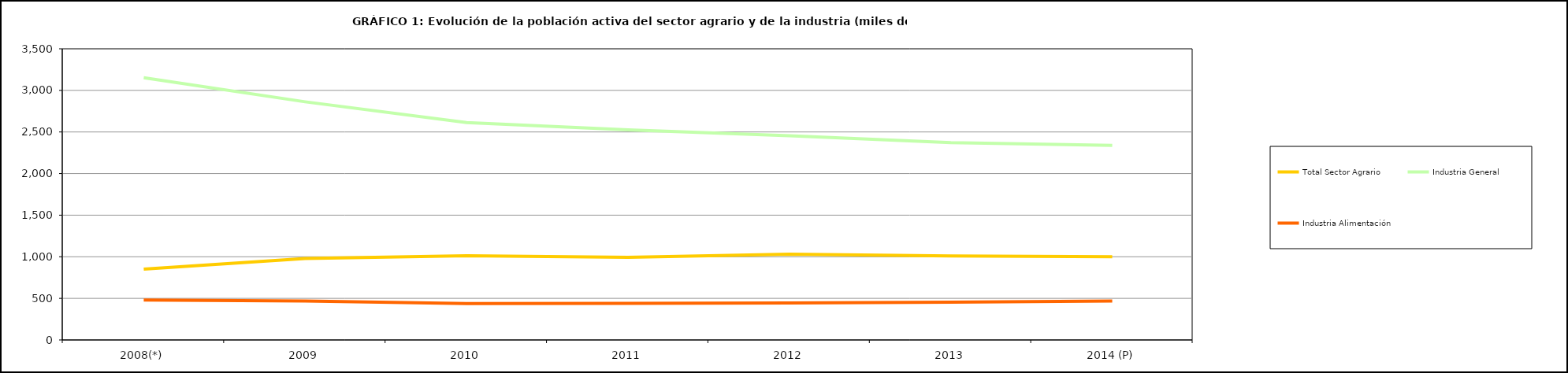
| Category | Total Sector Agrario | Industria General | Industria Alimentación |
|---|---|---|---|
| 2008(*) | 851.2 | 3151.7 | 479.675 |
| 2009 | 979.3 | 2862.5 | 467.6 |
| 2010 | 1011.9 | 2612.675 | 438.425 |
| 2011 | 993.225 | 2525.825 | 439.575 |
| 2012 | 1032.125 | 2454.25 | 445.725 |
| 2013 | 1010.5 | 2372.975 | 454.075 |
| 2014 (P) | 1000.9 | 2339.7 | 468.5 |